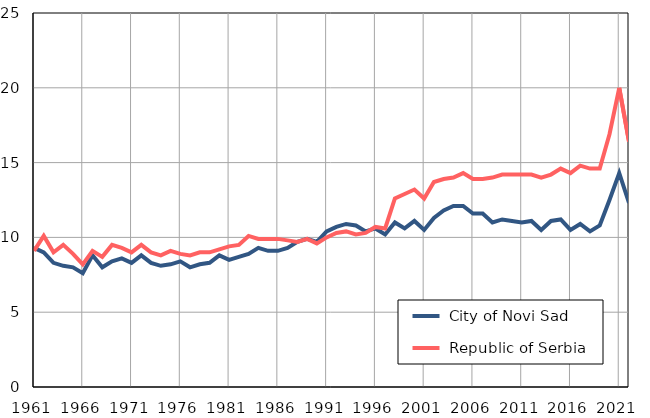
| Category |  City of Novi Sad |  Republic of Serbia |
|---|---|---|
| 1961.0 | 9.3 | 9.1 |
| 1962.0 | 9 | 10.1 |
| 1963.0 | 8.3 | 9 |
| 1964.0 | 8.1 | 9.5 |
| 1965.0 | 8 | 8.9 |
| 1966.0 | 7.6 | 8.2 |
| 1967.0 | 8.8 | 9.1 |
| 1968.0 | 8 | 8.7 |
| 1969.0 | 8.4 | 9.5 |
| 1970.0 | 8.6 | 9.3 |
| 1971.0 | 8.3 | 9 |
| 1972.0 | 8.8 | 9.5 |
| 1973.0 | 8.3 | 9 |
| 1974.0 | 8.1 | 8.8 |
| 1975.0 | 8.2 | 9.1 |
| 1976.0 | 8.4 | 8.9 |
| 1977.0 | 8 | 8.8 |
| 1978.0 | 8.2 | 9 |
| 1979.0 | 8.3 | 9 |
| 1980.0 | 8.8 | 9.2 |
| 1981.0 | 8.5 | 9.4 |
| 1982.0 | 8.7 | 9.5 |
| 1983.0 | 8.9 | 10.1 |
| 1984.0 | 9.3 | 9.9 |
| 1985.0 | 9.1 | 9.9 |
| 1986.0 | 9.1 | 9.9 |
| 1987.0 | 9.3 | 9.8 |
| 1988.0 | 9.7 | 9.7 |
| 1989.0 | 9.9 | 9.9 |
| 1990.0 | 9.7 | 9.6 |
| 1991.0 | 10.4 | 10 |
| 1992.0 | 10.7 | 10.3 |
| 1993.0 | 10.9 | 10.4 |
| 1994.0 | 10.8 | 10.2 |
| 1995.0 | 10.4 | 10.3 |
| 1996.0 | 10.6 | 10.7 |
| 1997.0 | 10.2 | 10.6 |
| 1998.0 | 11 | 12.6 |
| 1999.0 | 10.6 | 12.9 |
| 2000.0 | 11.1 | 13.2 |
| 2001.0 | 10.5 | 12.6 |
| 2002.0 | 11.3 | 13.7 |
| 2003.0 | 11.8 | 13.9 |
| 2004.0 | 12.1 | 14 |
| 2005.0 | 12.1 | 14.3 |
| 2006.0 | 11.6 | 13.9 |
| 2007.0 | 11.6 | 13.9 |
| 2008.0 | 11 | 14 |
| 2009.0 | 11.2 | 14.2 |
| 2010.0 | 11.1 | 14.2 |
| 2011.0 | 11 | 14.2 |
| 2012.0 | 11.1 | 14.2 |
| 2013.0 | 10.5 | 14 |
| 2014.0 | 11.1 | 14.2 |
| 2015.0 | 11.2 | 14.6 |
| 2016.0 | 10.5 | 14.3 |
| 2017.0 | 10.9 | 14.8 |
| 2018.0 | 10.4 | 14.6 |
| 2019.0 | 10.8 | 14.6 |
| 2020.0 | 12.5 | 16.9 |
| 2021.0 | 14.3 | 20 |
| 2022.0 | 12.3 | 16.4 |